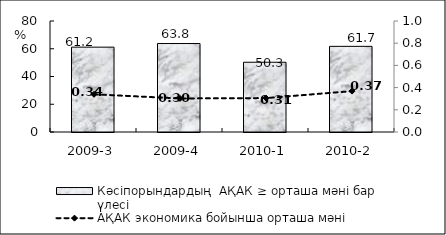
| Category | Кәсіпорындардың  АҚАК ≥ орташа мәні бар үлесі  |
|---|---|
| 2009-3 | 61.15 |
| 2009-4 | 63.77 |
| 2010-1 | 50.28 |
| 2010-2 | 61.73 |